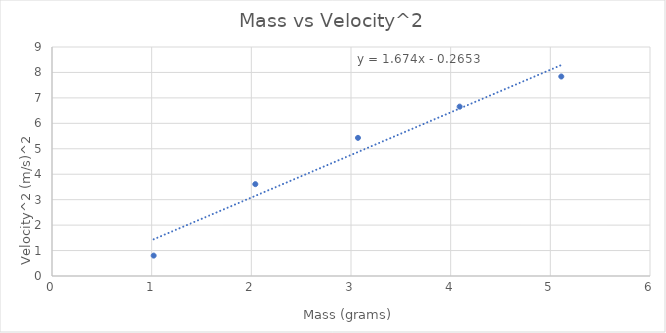
| Category | Series 0 |
|---|---|
| 1.02 | 0.801 |
| 2.04 | 3.61 |
| 3.07 | 5.429 |
| 4.09 | 6.656 |
| 5.11 | 7.84 |